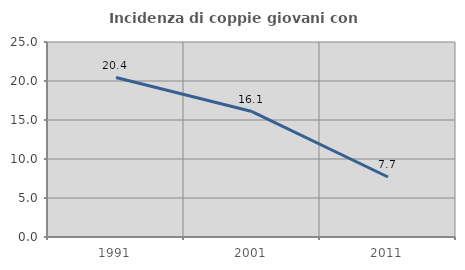
| Category | Incidenza di coppie giovani con figli |
|---|---|
| 1991.0 | 20.444 |
| 2001.0 | 16.086 |
| 2011.0 | 7.692 |